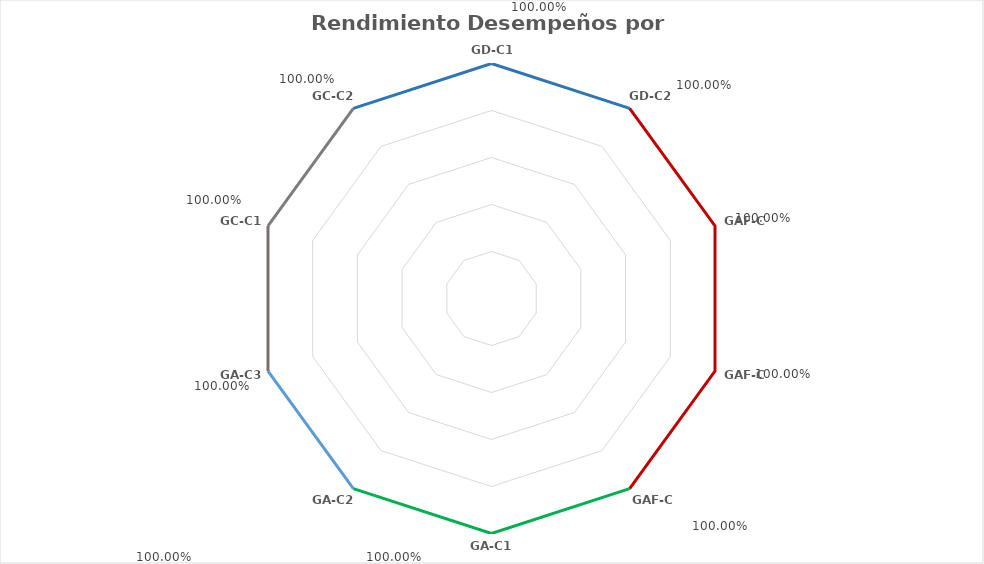
| Category | Series 0 |
|---|---|
| GD-C1 | 1 |
| GD-C2 | 1 |
| GAF-C1 | 1 |
| GAF-C2 | 1 |
| GAF-C3 | 1 |
| GA-C1 | 1 |
| GA-C2 | 1 |
| GA-C3 | 1 |
| GC-C1 | 1 |
| GC-C2 | 1 |